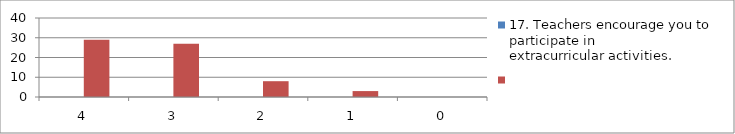
| Category | 17. Teachers encourage you to participate in
extracurricular activities. | Series 1 |
|---|---|---|
| 4.0 | 0 | 29 |
| 3.0 | 0 | 27 |
| 2.0 | 0 | 8 |
| 1.0 | 0 | 3 |
| 0.0 | 0 | 0 |